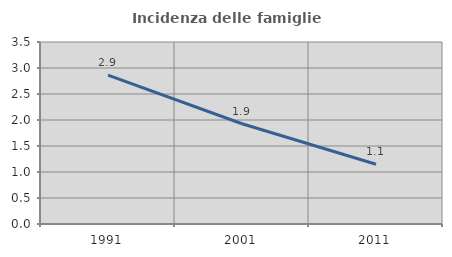
| Category | Incidenza delle famiglie numerose |
|---|---|
| 1991.0 | 2.865 |
| 2001.0 | 1.927 |
| 2011.0 | 1.148 |